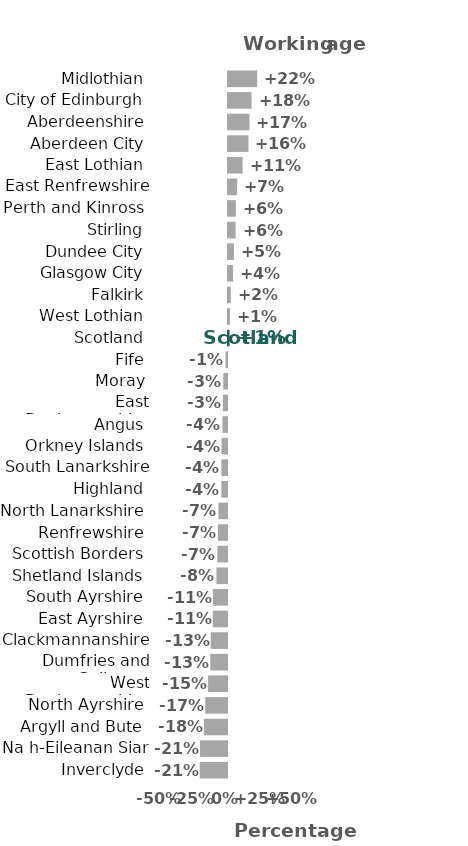
| Category | Series 0 |
|---|---|
| Inverclyde | -20.965 |
| Na h-Eileanan Siar | -20.744 |
| Argyll and Bute | -17.832 |
| North Ayrshire | -16.714 |
| West Dunbartonshire | -14.549 |
| Dumfries and Galloway | -12.91 |
| Clackmannanshire | -12.52 |
| East Ayrshire | -10.891 |
| South Ayrshire | -10.836 |
| Shetland Islands | -8.181 |
| Scottish Borders | -7.399 |
| Renfrewshire | -7.037 |
| North Lanarkshire | -6.579 |
| Highland | -4.357 |
| South Lanarkshire | -4.273 |
| Orkney Islands | -4.207 |
| Angus | -3.531 |
| East Dunbartonshire | -3.173 |
| Moray | -2.9 |
| Fife | -1.171 |
| Scotland | 1.224 |
| West Lothian | 1.473 |
| Falkirk | 2.171 |
| Glasgow City | 3.924 |
| Dundee City | 4.587 |
| Stirling | 5.866 |
| Perth and Kinross | 6.01 |
| East Renfrewshire | 7.08 |
| East Lothian | 11.207 |
| Aberdeen City | 15.732 |
| Aberdeenshire | 16.535 |
| City of Edinburgh | 18.148 |
| Midlothian | 22.442 |